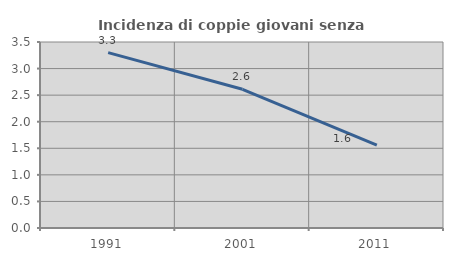
| Category | Incidenza di coppie giovani senza figli |
|---|---|
| 1991.0 | 3.3 |
| 2001.0 | 2.61 |
| 2011.0 | 1.559 |